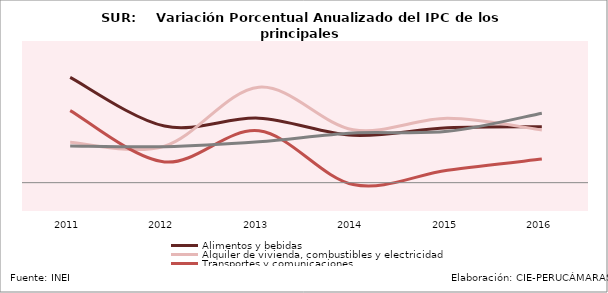
| Category | Alimentos y bebidas | Alquiler de vivienda, combustibles y electricidad | Transportes y comunicaciones | Esparcimiento,  servicios culturales y de enseñanza | 5.4% 3.1% 4.0% 2.7% 3.4% 3.8% |
|---|---|---|---|---|---|
| 2011.0 | 0.074 | 0.028 | 0.051 | 0.026 |  |
| 2012.0 | 0.04 | 0.026 | 0.015 | 0.025 |  |
| 2013.0 | 0.046 | 0.067 | 0.037 | 0.029 |  |
| 2014.0 | 0.033 | 0.037 | -0.001 | 0.035 |  |
| 2015.0 | 0.039 | 0.045 | 0.009 | 0.036 |  |
| 2016.0 | 0.04 | 0.037 | 0.017 | 0.049 |  |